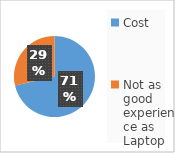
| Category | Series 0 |
|---|---|
| Cost | 5 |
| Not as good experience as Laptop | 2 |